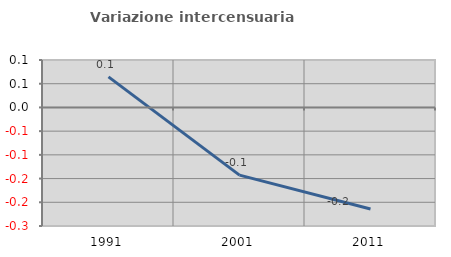
| Category | Variazione intercensuaria annua |
|---|---|
| 1991.0 | 0.064 |
| 2001.0 | -0.143 |
| 2011.0 | -0.214 |